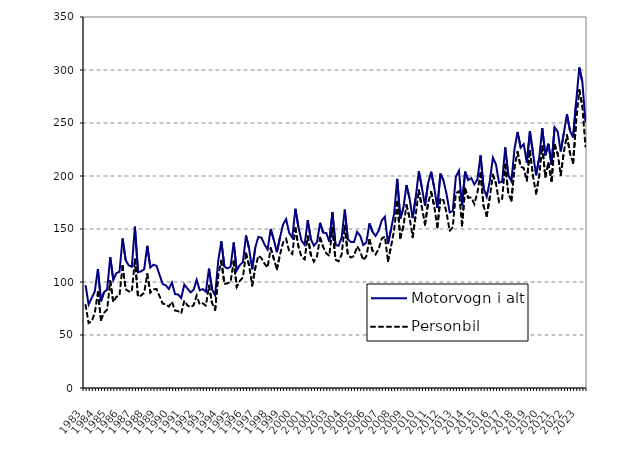
| Category | Motorvogn i alt | Personbil |
|---|---|---|
| 1983.0 | 97 | 78.3 |
| nan | 78.8 | 61.3 |
| nan | 84.8 | 63 |
| nan | 91.2 | 70.8 |
| 1984.0 | 112.2 | 90.4 |
| nan | 81.8 | 64.4 |
| nan | 90.4 | 71.1 |
| nan | 92.9 | 73.9 |
| 1985.0 | 123.4 | 100.8 |
| nan | 102 | 81.1 |
| nan | 108.4 | 86 |
| nan | 109.6 | 87.1 |
| 1986.0 | 141 | 115.2 |
| nan | 120.5 | 93.2 |
| nan | 115.7 | 91.1 |
| nan | 114.4 | 90.8 |
| 1987.0 | 152.2 | 121.3 |
| nan | 109.2 | 86.1 |
| nan | 110.1 | 87.3 |
| nan | 112 | 89.8 |
| 1988.0 | 134.1 | 107.5 |
| nan | 113.7 | 90 |
| nan | 116.3 | 93.1 |
| nan | 115.2 | 93.4 |
| 1989.0 | 106.6 | 86.4 |
| nan | 98 | 79.6 |
| nan | 96.9 | 79 |
| nan | 93.4 | 76.8 |
| 1990.0 | 99.4 | 81.3 |
| nan | 88.6 | 73.1 |
| nan | 88.2 | 72.5 |
| nan | 84.8 | 70.2 |
| 1991.0 | 97.5 | 82.4 |
| nan | 93.9 | 78 |
| nan | 90.2 | 76.1 |
| nan | 92.6 | 78.1 |
| 1992.0 | 102 | 87.1 |
| nan | 92.2 | 78.9 |
| nan | 93.3 | 79.9 |
| nan | 90.8 | 77.6 |
| 1993.0 | 112.6 | 96.5 |
| nan | 93 | 80.1 |
| nan | 87.5 | 73.6 |
| nan | 120.1 | 106.6 |
| 1994.0 | 138.4 | 120 |
| nan | 114.5 | 98.1 |
| nan | 112.8 | 98.8 |
| nan | 114.5 | 100.2 |
| 1995.0 | 137.2 | 119.3 |
| nan | 111 | 95.4 |
| nan | 115.9 | 101 |
| nan | 118.8 | 104.4 |
| 1996.0 | 143.9 | 126.9 |
| nan | 131.6 | 115.7 |
| nan | 112 | 96.7 |
| nan | 132.5 | 113.1 |
| 1997.0 | 142.6 | 124.8 |
| nan | 141.8 | 122.5 |
| nan | 135.4 | 117.3 |
| nan | 130.6 | 113.7 |
| 1998.0 | 150 | 131.9 |
| nan | 139.8 | 122 |
| nan | 128.1 | 112.1 |
| nan | 141.8 | 125.6 |
| 1999.0 | 154.2 | 137.1 |
| nan | 159.3 | 140.7 |
| nan | 146.3 | 128.7 |
| nan | 141.9 | 126.4 |
| 2000.0 | 169.1 | 150.9 |
| nan | 151.5 | 133.4 |
| nan | 139 | 123.5 |
| nan | 135.1 | 121.4 |
| 2001.0 | 158.5 | 143.1 |
| nan | 140.46 | 125.7 |
| nan | 134.24 | 119.2 |
| nan | 137.495 | 124.072 |
| 2002.0 | 155.814 | 141.724 |
| nan | 146.543 | 133.19 |
| nan | 146.231 | 127.141 |
| nan | 137.967 | 124.641 |
| 2003.0 | 165.679 | 150.811 |
| nan | 135.021 | 121.101 |
| nan | 134.111 | 119.491 |
| nan | 142.013 | 125.959 |
| 2004.0 | 168.309 | 153.043 |
| nan | 140.267 | 125.568 |
| nan | 137.77 | 123.121 |
| nan | 137.685 | 124.506 |
| 2005.0 | 147.311 | 133.756 |
| nan | 143.517 | 128.79 |
| nan | 134.783 | 120.571 |
| nan | 137.37 | 124.382 |
| 2006.0 | 155.213 | 139.728 |
| nan | 147.444 | 129.572 |
| nan | 143.451 | 126.006 |
| nan | 148.561 | 131.195 |
| 2007.0 | 158.1 | 141.084 |
| nan | 161.613 | 142.897 |
| nan | 135.821 | 119.753 |
| nan | 149.791 | 133.498 |
| 2008.0 | 164.642 | 148.614 |
| nan | 197.287 | 175.714 |
| nan | 159.718 | 141.407 |
| nan | 170.057 | 152.54 |
| 2009.0 | 191.38 | 172.559 |
| nan | 178.906 | 160.765 |
| nan | 160.234 | 142.312 |
| nan | 179.857 | 163.532 |
| 2010.0 | 204.636 | 186.507 |
| nan | 188.957 | 170.463 |
| nan | 172.077 | 154.156 |
| nan | 192.961 | 174.399 |
| 2011.0 | 204.005 | 184.86 |
| nan | 188.741 | 171.333 |
| nan | 169.934 | 151.694 |
| nan | 202.176 | 178.919 |
| 2012.0 | 195.829 | 177.072 |
| nan | 182.751 | 165.128 |
| nan | 165.73 | 148.242 |
| nan | 166.805 | 151.728 |
| 2013.0 | 199.181 | 183.653 |
| nan | 205.015 | 185.634 |
| nan | 172.044 | 153.21 |
| nan | 204.1 | 188.079 |
| 2014.0 | 196.177 | 179.552 |
| nan | 197.965 | 179.767 |
| nan | 192.105 | 173.474 |
| nan | 196.809 | 184.739 |
| 2015.0 | 219.419 | 202.592 |
| nan | 188.696 | 171.451 |
| nan | 180.388 | 162.297 |
| nan | 195.23 | 179.891 |
| 2016.0 | 217.298 | 201.197 |
| nan | 210.949 | 192.893 |
| nan | 193.648 | 175.642 |
| nan | 194.663 | 178.455 |
| 2017.0 | 227.029 | 210.738 |
| nan | 200.767 | 183.708 |
| nan | 195.059 | 176.766 |
| nan | 225.423 | 208.218 |
| 2018.0 | 241.528 | 222.678 |
| nan | 226.771 | 208.839 |
| nan | 230.044 | 207.395 |
| nan | 212.667 | 195.666 |
| 2019.0 | 242.056 | 223.584 |
| nan | 221.711 | 199.972 |
| nan | 200.668 | 183.518 |
| nan | 216.92 | 199.72 |
| 2020.0 | 245.163 | 227.947 |
| nan | 219.434 | 199.239 |
| nan | 230.409 | 212.039 |
| nan | 210.538 | 195.423 |
| 2021.0 | 246.037 | 229.482 |
| nan | 241.941 | 221.096 |
| nan | 223.162 | 200.95 |
| nan | 240.674 | 222.834 |
| 2022.0 | 258.319 | 238.379 |
| nan | 242.592 | 221.267 |
| nan | 236.373 | 212.275 |
| nan | 270.368 | 251.769 |
| 2023.0 | 302.388 | 281.084 |
| nan | 288.712 | 265.488 |
| nan | 250.488 | 227.832 |